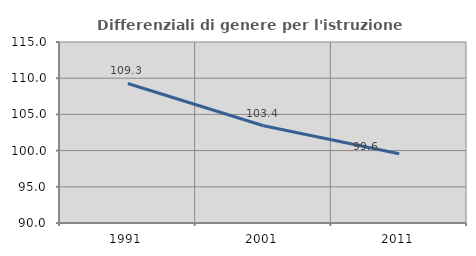
| Category | Differenziali di genere per l'istruzione superiore |
|---|---|
| 1991.0 | 109.275 |
| 2001.0 | 103.428 |
| 2011.0 | 99.569 |